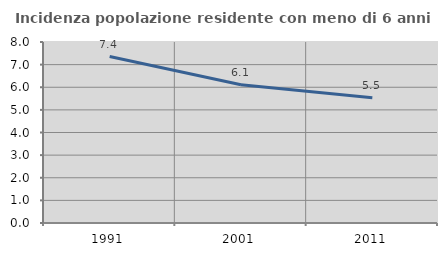
| Category | Incidenza popolazione residente con meno di 6 anni |
|---|---|
| 1991.0 | 7.356 |
| 2001.0 | 6.111 |
| 2011.0 | 5.539 |